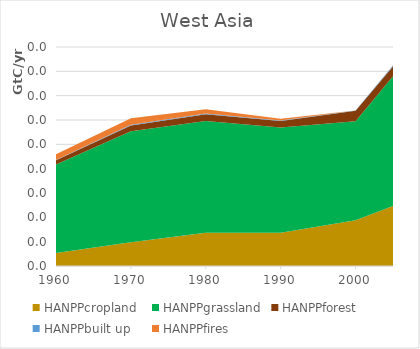
| Category | HANPPcropland | HANPPgrassland | HANPPforest | HANPPbuilt up | HANPPfires |
|---|---|---|---|---|---|
| 1960.0 | 2694.575 | 18165.793 | 863.211 | 63.755 | 1164 |
| 1970.0 | 4879.138 | 22797.299 | 1205.037 | 135.512 | 1344 |
| 1980.0 | 6828.77 | 22984.055 | 1347.048 | 191.447 | 864.84 |
| 1990.0 | 6845.93 | 21614.345 | 1359.348 | 98.46 | 335.403 |
| 2000.0 | 9406.272 | 20342.102 | 2135.778 | 81.701 | 8.163 |
| 2005.0 | 12352.828 | 26640.953 | 1993.976 | 235.291 | 24.535 |